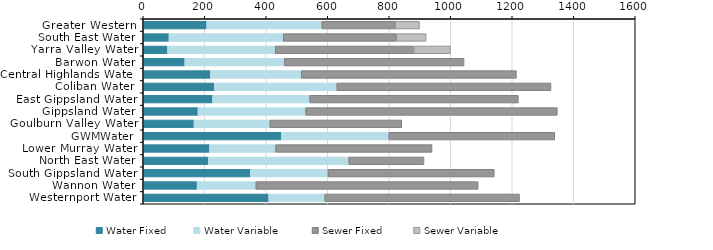
| Category | Water Fixed | Water Variable   | Sewer Fixed  | Sewer Variable   |
|---|---|---|---|---|
| Greater Western | 206.31 | 374.54 | 238.72 | 78.836 |
| South East Water | 83.73 | 371.472 | 367.76 | 96.858 |
| Yarra Valley Water | 78.97 | 350.26 | 451.05 | 118.419 |
| Barwon Water | 135.11 | 323.837 | 584.37 | 0 |
| Central Highlands Water | 218.76 | 295.203 | 699.64 | 0 |
| Coliban Water | 231.75 | 397.798 | 696.46 | 0 |
| East Gippsland Water | 225.53 | 315.909 | 678.43 | 0 |
| Gippsland Water | 178.14 | 350.097 | 818.45 | 0 |
| Goulburn Valley Water | 165.16 | 246.596 | 428.98 | 0 |
| GWMWater | 449.4 | 349.453 | 539.57 | 0 |
| Lower Murray Water | 215.46 | 215.077 | 508.66 | 0 |
| North East Water | 211.71 | 456.887 | 244.48 | 0 |
| South Gippsland Water | 348.52 | 252.222 | 540.89 | 0 |
| Wannon Water | 175.21 | 191.06 | 722.87 | 0 |
| Westernport Water | 408.16 | 182.369 | 633.18 | 0 |